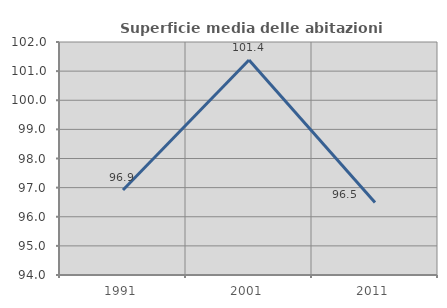
| Category | Superficie media delle abitazioni occupate |
|---|---|
| 1991.0 | 96.917 |
| 2001.0 | 101.383 |
| 2011.0 | 96.493 |